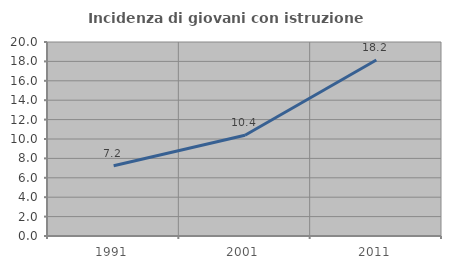
| Category | Incidenza di giovani con istruzione universitaria |
|---|---|
| 1991.0 | 7.242 |
| 2001.0 | 10.393 |
| 2011.0 | 18.152 |